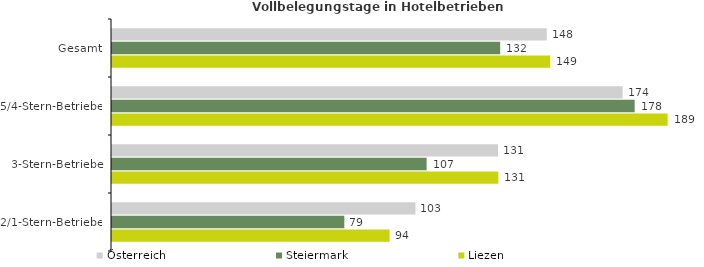
| Category | Österreich | Steiermark | Liezen |
|---|---|---|---|
| Gesamt | 147.876 | 132.038 | 149.054 |
| 5/4-Stern-Betriebe | 173.697 | 177.779 | 189.007 |
| 3-Stern-Betriebe | 131.294 | 107.011 | 131.403 |
| 2/1-Stern-Betriebe | 103.222 | 79.024 | 94.424 |